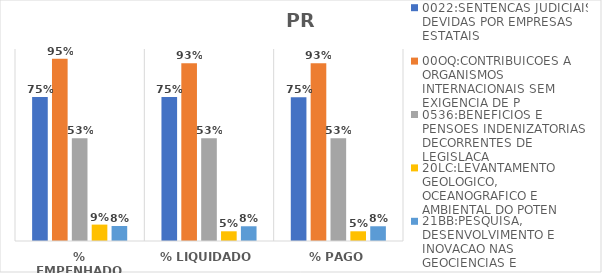
| Category | 0022:SENTENCAS JUDICIAIS DEVIDAS POR EMPRESAS ESTATAIS | 00OQ:CONTRIBUICOES A ORGANISMOS INTERNACIONAIS SEM EXIGENCIA DE P | 0536:BENEFICIOS E PENSOES INDENIZATORIAS DECORRENTES DE LEGISLACA | 20LC:LEVANTAMENTO GEOLOGICO, OCEANOGRAFICO E AMBIENTAL DO POTEN | 21BB:PESQUISA, DESENVOLVIMENTO E INOVACAO NAS GEOCIENCIAS E |
|---|---|---|---|---|---|
| % EMPENHADO | 0.751 | 0.95 | 0.535 | 0.085 | 0.078 |
| % LIQUIDADO | 0.751 | 0.926 | 0.535 | 0.051 | 0.077 |
| % PAGO | 0.749 | 0.926 | 0.535 | 0.051 | 0.077 |